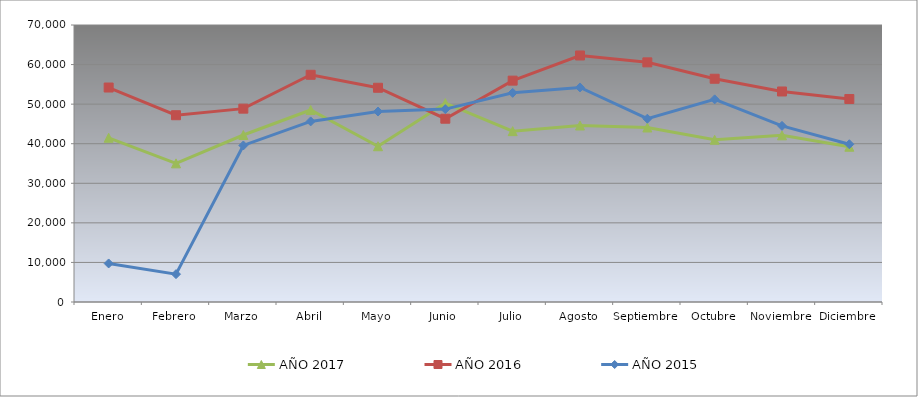
| Category | AÑO 2017 | AÑO 2016 | AÑO 2015 |
|---|---|---|---|
| Enero | 41500 | 54200 | 9740 |
| Febrero | 35040 | 47200 | 7040 |
| Marzo | 42200 | 48860 | 39560 |
| Abril | 48520 | 57420 | 45639.105 |
| Mayo | 39360 | 54140 | 48133.202 |
| Junio | 50260 | 46320 | 48744.781 |
| Julio | 43180 | 55940 | 52853.83 |
| Agosto | 44600 | 62300 | 54220.327 |
| Septiembre | 44100 | 60560 | 46317.576 |
| Octubre | 41000 | 56420 | 51210.21 |
| Noviembre | 42120 | 53200 | 44511.506 |
| Diciembre | 39240 | 51300 | 39867.326 |